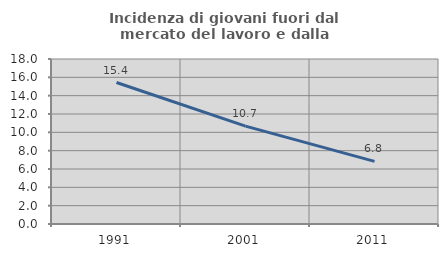
| Category | Incidenza di giovani fuori dal mercato del lavoro e dalla formazione  |
|---|---|
| 1991.0 | 15.436 |
| 2001.0 | 10.674 |
| 2011.0 | 6.832 |